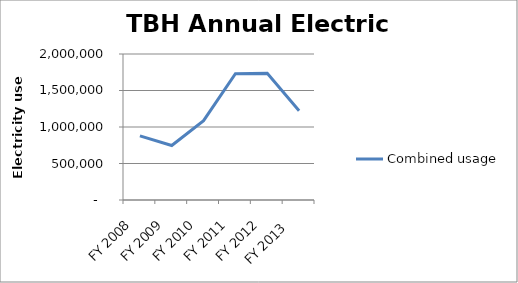
| Category | Combined usage |
|---|---|
| FY 2008 | 877792 |
| FY 2009 | 746880 |
| FY 2010 | 1086560 |
| FY 2011 | 1729280 |
| FY 2012 | 1734560 |
| FY 2013  | 1222640 |